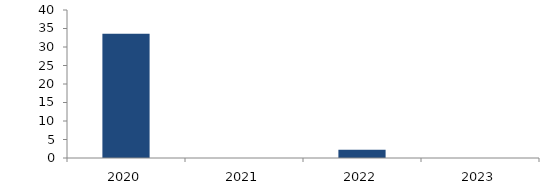
| Category | Bogotá |
|---|---|
| 2020.0 | 33.553 |
| 2021.0 | 0 |
| 2022.0 | 2.254 |
| 2023.0 | 0 |